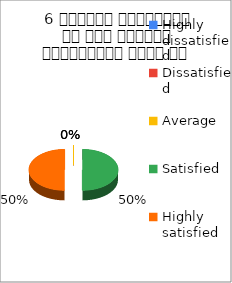
| Category | 6 शिक्षक समयनिष्ट है एवं नियमित व्याख्यान देते है  |
|---|---|
| Highly dissatisfied | 0 |
| Dissatisfied | 0 |
| Average | 0 |
| Satisfied | 1 |
| Highly satisfied | 1 |